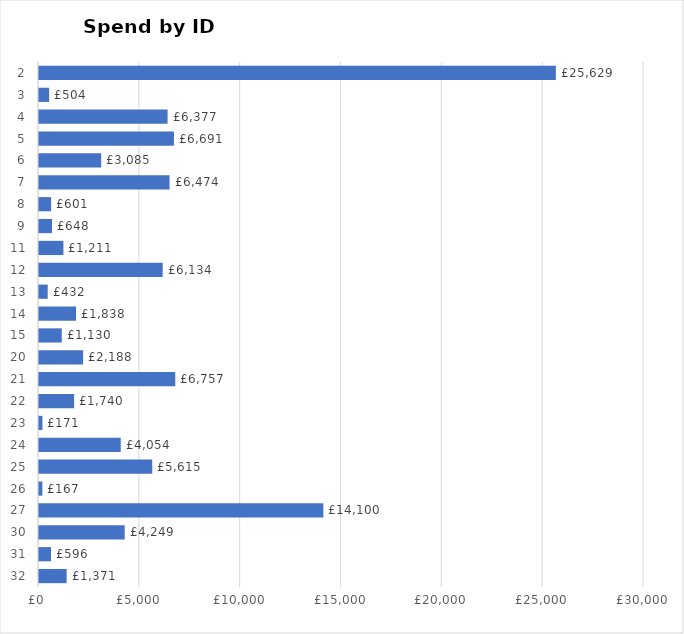
| Category | Total |
|---|---|
| 32 | 1371 |
| 31 | 596.2 |
| 30 | 4249.48 |
| 27 | 14100 |
| 26 | 166.59 |
| 25 | 5615.49 |
| 24 | 4053.5 |
| 23 | 171 |
| 22 | 1740 |
| 21 | 6756.68 |
| 20 | 2188.2 |
| 15 | 1129.69 |
| 14 | 1838.15 |
| 13 | 432 |
| 12 | 6134 |
| 11 | 1210.92 |
| 9 | 648 |
| 8 | 601.2 |
| 7 | 6474 |
| 6 | 3085 |
| 5 | 6690.76 |
| 4 | 6376.68 |
| 3 | 503.8 |
| 2 | 25628.86 |